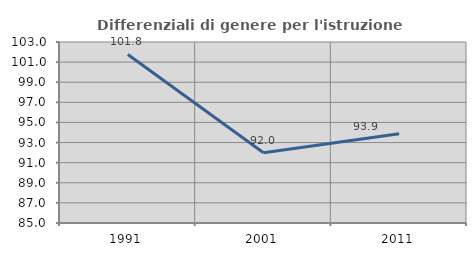
| Category | Differenziali di genere per l'istruzione superiore |
|---|---|
| 1991.0 | 101.763 |
| 2001.0 | 91.992 |
| 2011.0 | 93.865 |